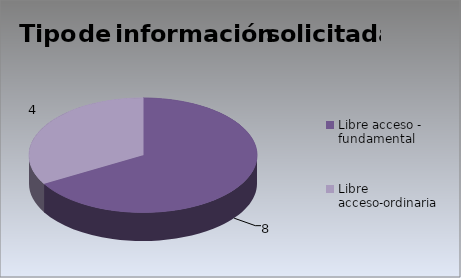
| Category | Series 0 |
|---|---|
| Libre acceso - fundamental | 8 |
| Libre acceso-ordinaria  | 4 |